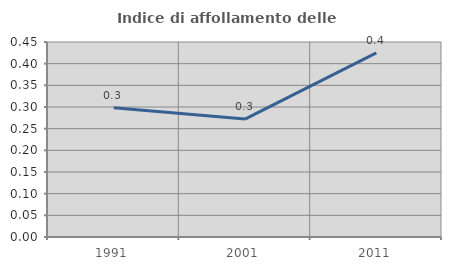
| Category | Indice di affollamento delle abitazioni  |
|---|---|
| 1991.0 | 0.298 |
| 2001.0 | 0.272 |
| 2011.0 | 0.425 |